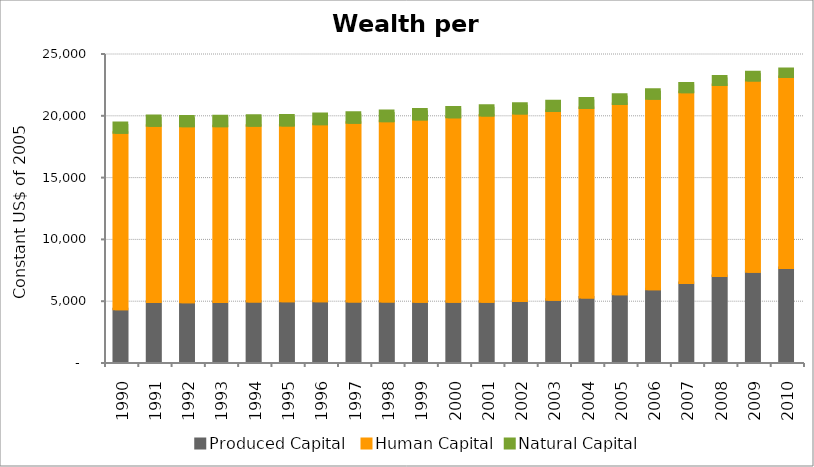
| Category | Produced Capital  | Human Capital | Natural Capital |
|---|---|---|---|
| 1990.0 | 4264.414 | 14281.33 | 787.335 |
| 1991.0 | 4855.08 | 14253.02 | 785.26 |
| 1992.0 | 4839.229 | 14239.683 | 789.836 |
| 1993.0 | 4844.489 | 14236.938 | 798.695 |
| 1994.0 | 4895.953 | 14228.203 | 808.048 |
| 1995.0 | 4910.189 | 14227.081 | 814.703 |
| 1996.0 | 4914.889 | 14327.357 | 817.4 |
| 1997.0 | 4904.004 | 14454.465 | 816.616 |
| 1998.0 | 4893.106 | 14594.167 | 812.765 |
| 1999.0 | 4873.472 | 14756.052 | 806.951 |
| 2000.0 | 4873.455 | 14921.674 | 800.039 |
| 2001.0 | 4876.824 | 15065.351 | 791.832 |
| 2002.0 | 4932.505 | 15179.294 | 782.151 |
| 2003.0 | 5046.423 | 15270.595 | 771.372 |
| 2004.0 | 5210.55 | 15347.361 | 759.952 |
| 2005.0 | 5472.906 | 15410.47 | 748.233 |
| 2006.0 | 5883.427 | 15419.969 | 729.835 |
| 2007.0 | 6390.723 | 15438.176 | 711.38 |
| 2008.0 | 6963.912 | 15446.019 | 692.849 |
| 2009.0 | 7297.388 | 15477.689 | 674.162 |
| 2010.0 | 7595.336 | 15463.451 | 655.291 |